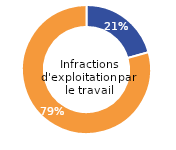
| Category | Femmes |
|---|---|
| Femmes | 20.672 |
| Hommes | 79.328 |